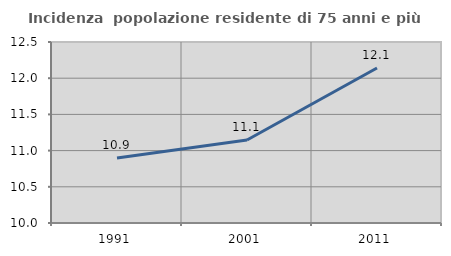
| Category | Incidenza  popolazione residente di 75 anni e più |
|---|---|
| 1991.0 | 10.897 |
| 2001.0 | 11.147 |
| 2011.0 | 12.14 |